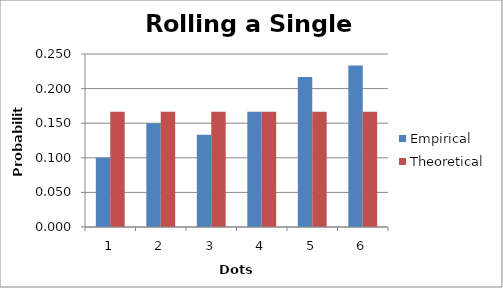
| Category | Empirical | Theoretical |
|---|---|---|
| 1.0 | 0.1 | 0.167 |
| 2.0 | 0.15 | 0.167 |
| 3.0 | 0.133 | 0.167 |
| 4.0 | 0.167 | 0.167 |
| 5.0 | 0.217 | 0.167 |
| 6.0 | 0.233 | 0.167 |